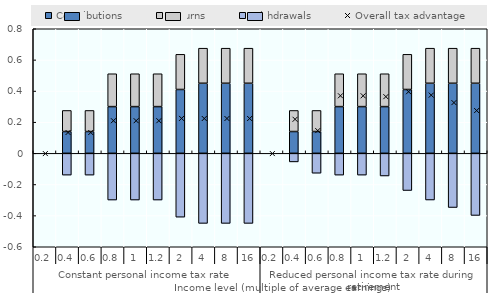
| Category | Contributions | Returns | Withdrawals |
|---|---|---|---|
| 0 | 0 | 0 | 0 |
| 1 | 0.14 | 0.135 | -0.14 |
| 2 | 0.14 | 0.135 | -0.14 |
| 3 | 0.3 | 0.211 | -0.3 |
| 4 | 0.3 | 0.211 | -0.3 |
| 5 | 0.3 | 0.211 | -0.3 |
| 6 | 0.41 | 0.226 | -0.41 |
| 7 | 0.45 | 0.225 | -0.45 |
| 8 | 0.45 | 0.225 | -0.45 |
| 9 | 0.45 | 0.225 | -0.45 |
| 10 | 0 | 0 | 0 |
| 11 | 0.14 | 0.135 | -0.055 |
| 12 | 0.14 | 0.135 | -0.128 |
| 13 | 0.3 | 0.211 | -0.14 |
| 14 | 0.3 | 0.211 | -0.14 |
| 15 | 0.3 | 0.211 | -0.145 |
| 16 | 0.41 | 0.226 | -0.239 |
| 17 | 0.45 | 0.225 | -0.3 |
| 18 | 0.45 | 0.225 | -0.348 |
| 19 | 0.45 | 0.225 | -0.399 |